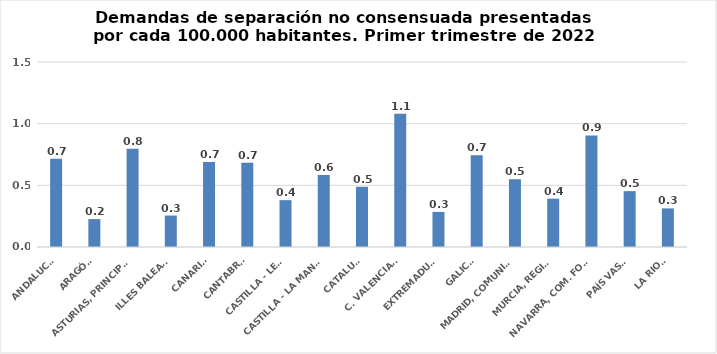
| Category | Series 0 |
|---|---|
| ANDALUCÍA | 0.716 |
| ARAGÓN | 0.226 |
| ASTURIAS, PRINCIPADO | 0.796 |
| ILLES BALEARS | 0.255 |
| CANARIAS | 0.689 |
| CANTABRIA | 0.684 |
| CASTILLA - LEÓN | 0.38 |
| CASTILLA - LA MANCHA | 0.585 |
| CATALUÑA | 0.488 |
| C. VALENCIANA | 1.08 |
| EXTREMADURA | 0.285 |
| GALICIA | 0.744 |
| MADRID, COMUNIDAD | 0.549 |
| MURCIA, REGIÓN | 0.392 |
| NAVARRA, COM. FORAL | 0.904 |
| PAÍS VASCO | 0.453 |
| LA RIOJA | 0.313 |